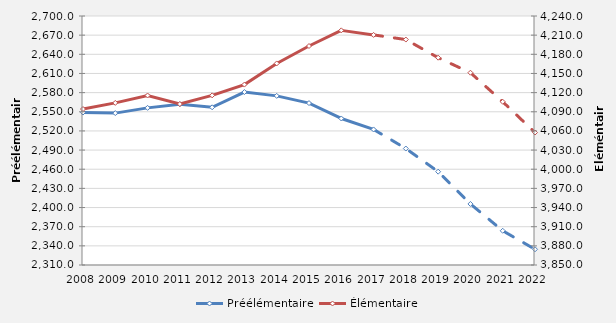
| Category | Préélémentaire |
|---|---|
| 2008.0 | 2548.8 |
| 2009.0 | 2547.9 |
| 2010.0 | 2556.1 |
| 2011.0 | 2561.8 |
| 2012.0 | 2557 |
| 2013.0 | 2580.9 |
| 2014.0 | 2574.9 |
| 2015.0 | 2563.6 |
| 2016.0 | 2539.5 |
| 2017.0 | 2522.3 |
| 2018.0 | 2492.4 |
| 2019.0 | 2456.2 |
| 2020.0 | 2405.6 |
| 2021.0 | 2363.6 |
| 2022.0 | 2334.6 |